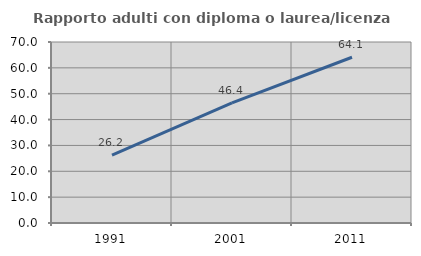
| Category | Rapporto adulti con diploma o laurea/licenza media  |
|---|---|
| 1991.0 | 26.22 |
| 2001.0 | 46.442 |
| 2011.0 | 64.098 |